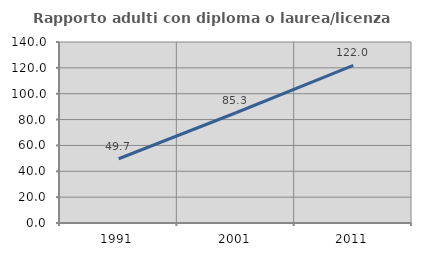
| Category | Rapporto adulti con diploma o laurea/licenza media  |
|---|---|
| 1991.0 | 49.695 |
| 2001.0 | 85.287 |
| 2011.0 | 121.951 |